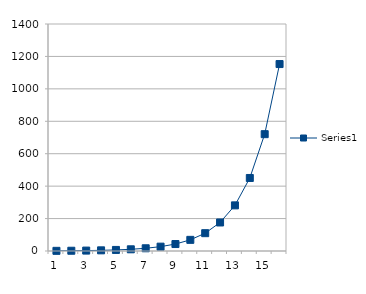
| Category | Series 0 |
|---|---|
| 0 | 1 |
| 1 | 1.6 |
| 2 | 2.56 |
| 3 | 4.096 |
| 4 | 6.554 |
| 5 | 10.486 |
| 6 | 16.777 |
| 7 | 26.844 |
| 8 | 42.95 |
| 9 | 68.719 |
| 10 | 109.951 |
| 11 | 175.922 |
| 12 | 281.475 |
| 13 | 450.36 |
| 14 | 720.576 |
| 15 | 1152.922 |